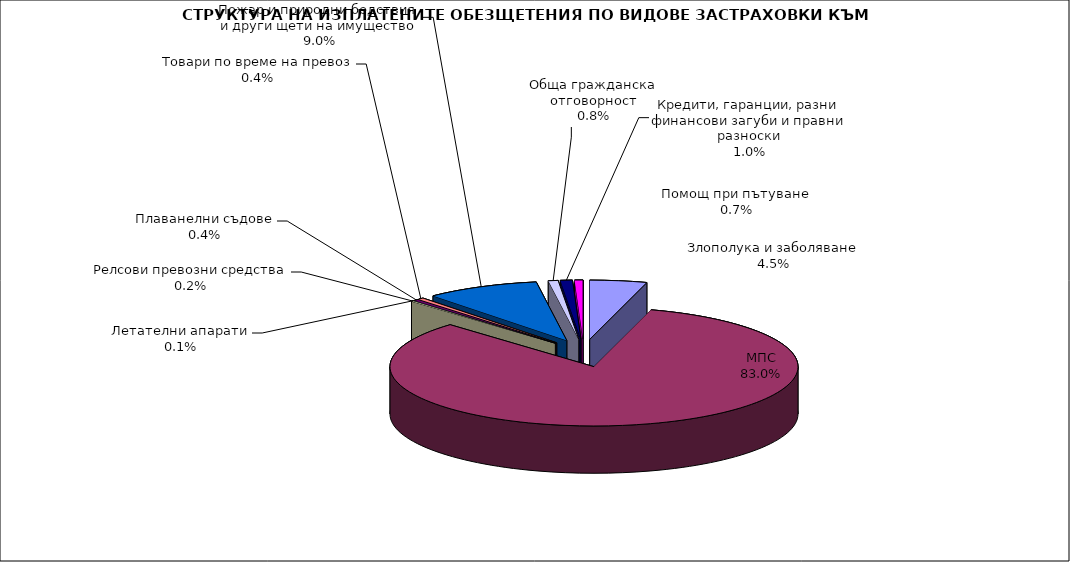
| Category | Series 0 |
|---|---|
| Злополука и заболяване | 0.045 |
| МПС | 0.83 |
| Релсови превозни средства | 0.002 |
| Летателни апарати | 0.001 |
| Плаванелни съдове | 0.004 |
| Товари по време на превоз | 0.004 |
| Пожар и природни бедствия и други щети на имущество | 0.09 |
| Обща гражданска отговорност | 0.008 |
| Кредити, гаранции, разни финансови загуби и правни разноски | 0.01 |
| Помощ при пътуване | 0.007 |